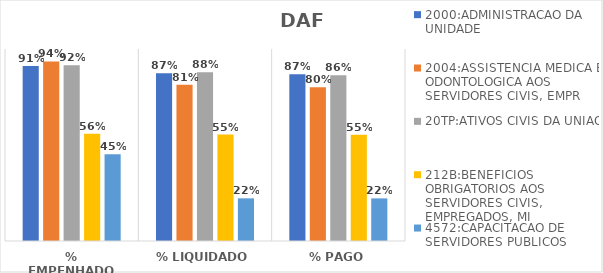
| Category | 2000:ADMINISTRACAO DA UNIDADE | 2004:ASSISTENCIA MEDICA E ODONTOLOGICA AOS SERVIDORES CIVIS, EMPR | 20TP:ATIVOS CIVIS DA UNIAO | 212B:BENEFICIOS OBRIGATORIOS AOS SERVIDORES CIVIS, EMPREGADOS, MI | 4572:CAPACITACAO DE SERVIDORES PUBLICOS FEDERAIS EM PROCESSO DE Q |
|---|---|---|---|---|---|
| % EMPENHADO | 0.911 | 0.935 | 0.916 | 0.558 | 0.452 |
| % LIQUIDADO | 0.873 | 0.814 | 0.879 | 0.555 | 0.222 |
| % PAGO | 0.868 | 0.8 | 0.864 | 0.554 | 0.222 |